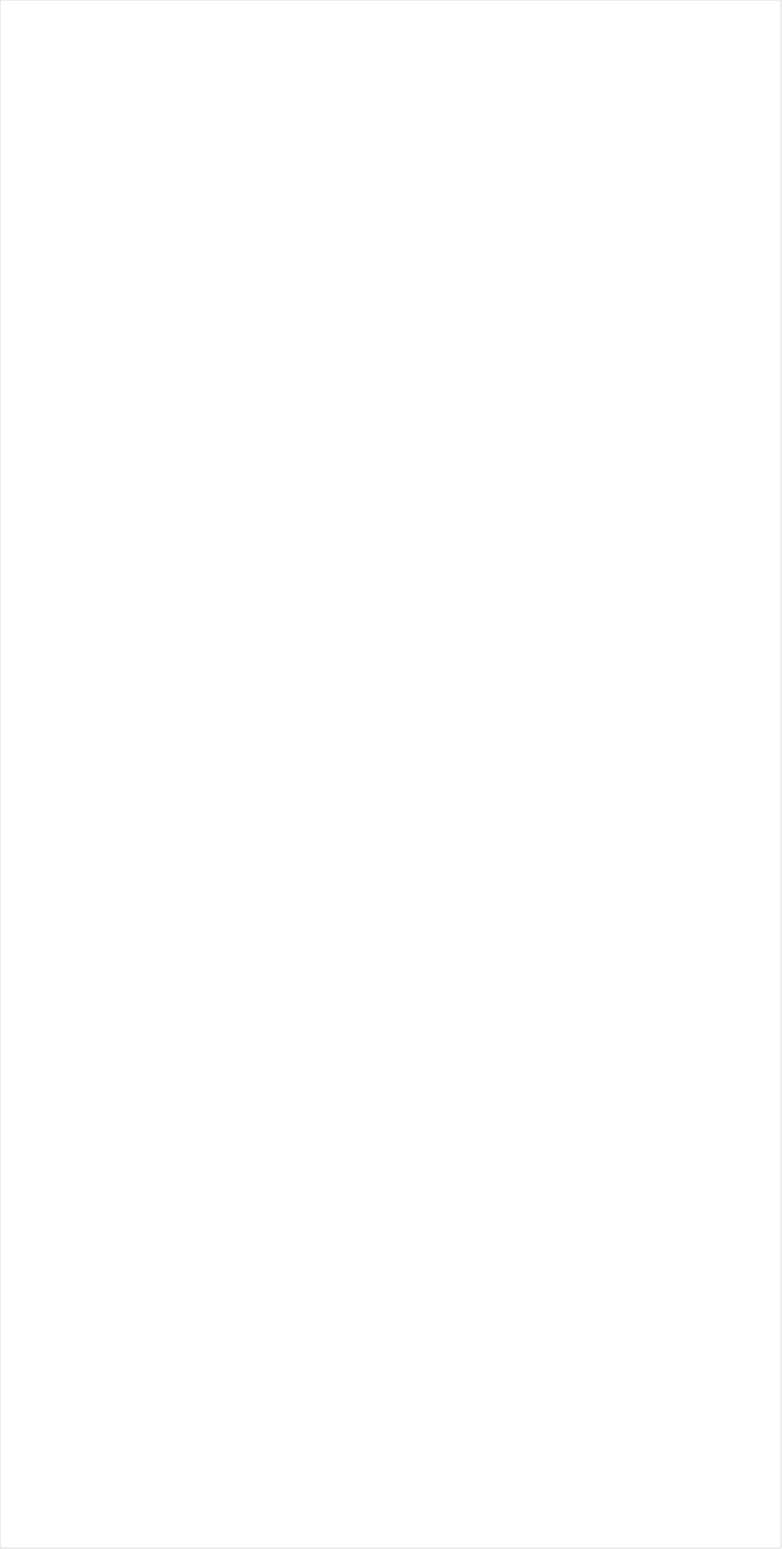
| Category | Total |
|---|---|
| PBS | -0.167 |
| INSP | -0.159 |
| Hallmark Movies & Mysteries | -0.153 |
| RFD TV | -0.147 |
| Fox Business | -0.145 |
| MSNBC | -0.114 |
| Bloomberg HD | -0.109 |
| Hallmark | -0.093 |
| Weather Channel | -0.086 |
| Smithsonian | -0.086 |
| Fox News | -0.081 |
| Outdoor Channel | -0.062 |
| SundanceTV | -0.055 |
| National Geographic Wild | -0.055 |
| CBS | -0.054 |
| Great American Country | -0.052 |
| Golf | -0.052 |
| TV LAND | -0.042 |
| WGN America | -0.042 |
| ION | -0.038 |
| DIY | -0.033 |
| UP TV | -0.033 |
| American Heroes Channel | -0.029 |
| NBC | -0.029 |
| CNBC | -0.029 |
| Science Channel | -0.026 |
| Game Show | -0.026 |
| HGTV | -0.023 |
| The Sportsman Channel | -0.022 |
| CNN | -0.021 |
| ABC | -0.018 |
| National Geographic | -0.015 |
| History Channel | -0.014 |
| Animal Planet | -0.011 |
| Tennis Channel | -0.008 |
| BBC America | -0.008 |
| Big Ten Network | -0.008 |
| Discovery Life Channel | -0.007 |
| NHL | -0.006 |
| CW | -0.006 |
| FYI | -0.005 |
| Headline News | -0.002 |
| Fox Sports 1 | 0 |
| Olympic Channel | 0.003 |
| Disney Junior US | 0.003 |
| CBS Sports | 0.003 |
| POP | 0.004 |
| TUDN | 0.004 |
| Motor Trend Network | 0.005 |
| FOX | 0.006 |
| NBC Sports | 0.006 |
| AMC | 0.012 |
| FXDEP | 0.012 |
| Food Network | 0.013 |
| Oprah Winfrey Network | 0.014 |
| Lifetime Movies | 0.015 |
| CMTV | 0.017 |
| FX Movie Channel | 0.017 |
| Investigation Discovery | 0.02 |
| WE TV | 0.021 |
| Discovery Channel | 0.021 |
| Destination America | 0.022 |
| TLC | 0.022 |
| Lifetime | 0.024 |
| USA Network | 0.024 |
| Nick Jr. | 0.025 |
| OXYGEN | 0.026 |
| Ovation | 0.026 |
| UniMas | 0.031 |
| Travel | 0.032 |
| MLB Network | 0.033 |
| A&E | 0.033 |
| Independent Film (IFC) | 0.038 |
| Galavision | 0.041 |
| TBS | 0.041 |
| Discovery Family Channel | 0.042 |
| SYFY | 0.042 |
| FX | 0.042 |
| Freeform | 0.043 |
| MTV2 | 0.044 |
| Telemundo | 0.046 |
| E! | 0.047 |
| Adult Swim | 0.048 |
| MyNetworkTV | 0.049 |
| Logo | 0.049 |
| Paramount Network | 0.051 |
| Univision | 0.057 |
| NFL Network | 0.06 |
| NBC Universo | 0.06 |
| ESPNU | 0.061 |
| ESPN | 0.062 |
| BRAVO | 0.063 |
| FXX | 0.063 |
| Reelz Channel | 0.064 |
| Cooking Channel | 0.066 |
| PAC-12 Network | 0.066 |
| BET | 0.066 |
| NBA TV | 0.067 |
| MTV | 0.068 |
| TNT | 0.069 |
| Universal Kids | 0.07 |
| Disney Channel | 0.071 |
| ESPN Deportes | 0.077 |
| Comedy Central | 0.083 |
| ESPN2 | 0.085 |
| VH1 | 0.09 |
| Nick@Nite | 0.091 |
| ESPNEWS | 0.094 |
| truTV | 0.099 |
| Viceland | 0.101 |
| BET Her | 0.101 |
| Nick Toons | 0.103 |
| Nick | 0.108 |
| Cartoon Network | 0.12 |
| TV ONE | 0.123 |
| Teen Nick | 0.15 |
| Disney XD | 0.156 |